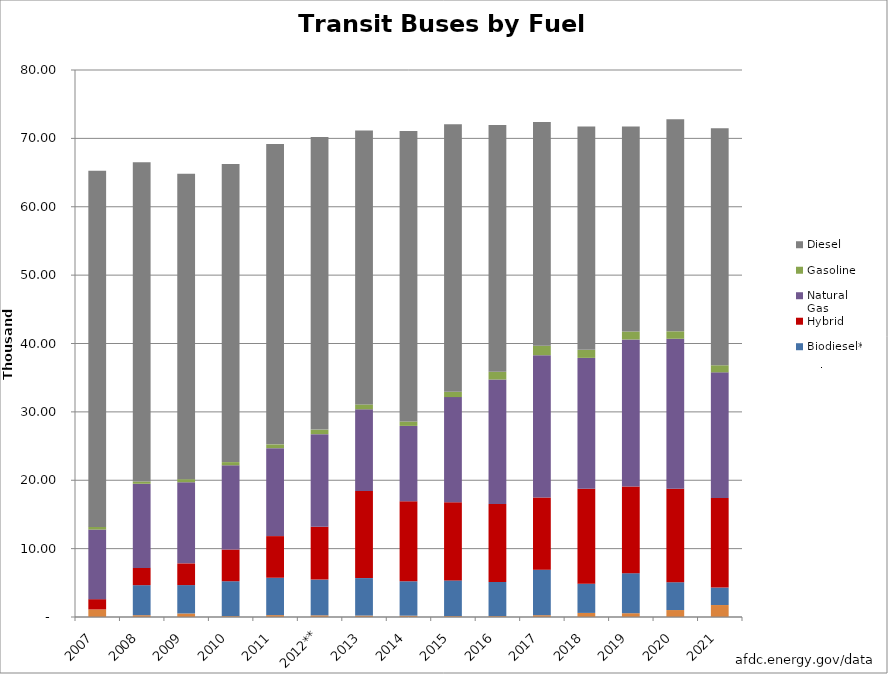
| Category | Other | Biodiesel* | Hybrid | Natural Gas | Gasoline | Diesel |
|---|---|---|---|---|---|---|
| 2007 | 1109.233 | 0 | 1500.727 | 10178.844 | 391.494 | 52068.702 |
| 2008 | 266.024 | 4389.396 | 2527.228 | 12303.61 | 332.53 | 46687.212 |
| 2009 | 518.656 | 4149.248 | 3176.768 | 11864.256 | 453.824 | 44669.248 |
| 2010 | 132.478 | 5100.403 | 4636.73 | 12320.454 | 463.673 | 43585.262 |
| 2011 | 276.7 | 5464.825 | 6087.4 | 12866.55 | 553.4 | 43926.125 |
|   2012** | 245.654 | 5228.932 | 7720.57 | 13546.091 | 666.776 | 42778.976 |
| 2013 | 213.417 | 5477.703 | 12733.881 | 11951.352 | 711.39 | 40051.257 |
| 2014 | 195.039 | 5030.213 | 11691.804 | 11031.138 | 650.13 | 42467.676 |
| 2015 | 132.04 | 5223.39 | 11414.858 | 15391.271 | 773.449 | 39139.933 |
| 2016 | 132.784 | 4990.904 | 11391.98 | 18218.552 | 1130.544 | 36091.217 |
| 2017 | 266.104 | 6662.267 | 10557.996 | 20799.729 | 1382.965 | 32717.939 |
| 2018 | 597.366 | 4274.781 | 13872.166 | 19150.678 | 1177.619 | 32670.643 |
| 2019 | 556.728 | 5849.945 | 12696.404 | 21486.387 | 1165.828 | 29988.68 |
| 2020 | 1017.316 | 4069.263 | 13661.098 | 21944.956 | 1089.981 | 31028.133 |
| 2021 | 1750.5 | 2557.874 | 13103.747 | 18369.538 | 1036.011 | 34652.765 |